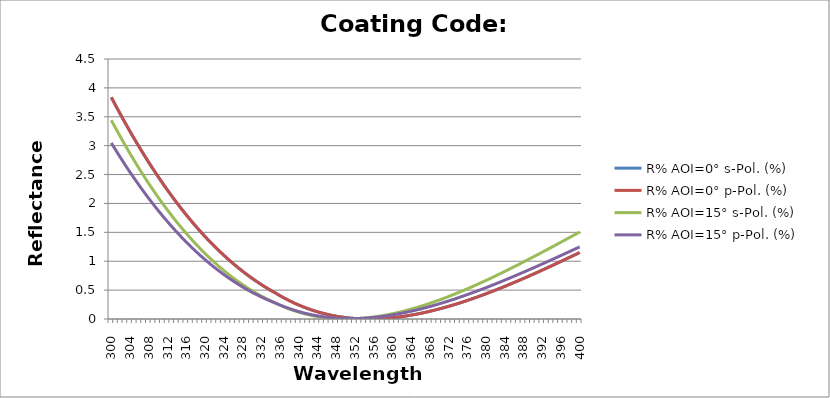
| Category | R% AOI=0° s-Pol. (%) | R% AOI=0° p-Pol. (%) | R% AOI=15° s-Pol. (%) | R% AOI=15° p-Pol. (%) |
|---|---|---|---|---|
| 300.0 | 3.836 | 3.836 | 3.44 | 3.047 |
| 301.0 | 3.683 | 3.683 | 3.29 | 2.915 |
| 302.0 | 3.534 | 3.534 | 3.143 | 2.786 |
| 303.0 | 3.387 | 3.387 | 3 | 2.661 |
| 304.0 | 3.245 | 3.245 | 2.861 | 2.54 |
| 305.0 | 3.106 | 3.106 | 2.726 | 2.421 |
| 306.0 | 2.97 | 2.97 | 2.595 | 2.306 |
| 307.0 | 2.838 | 2.838 | 2.467 | 2.194 |
| 308.0 | 2.709 | 2.709 | 2.343 | 2.086 |
| 309.0 | 2.584 | 2.584 | 2.223 | 1.98 |
| 310.0 | 2.462 | 2.462 | 2.106 | 1.878 |
| 311.0 | 2.344 | 2.344 | 1.993 | 1.78 |
| 312.0 | 2.229 | 2.229 | 1.884 | 1.684 |
| 313.0 | 2.117 | 2.117 | 1.778 | 1.591 |
| 314.0 | 2.009 | 2.009 | 1.675 | 1.502 |
| 315.0 | 1.904 | 1.904 | 1.576 | 1.415 |
| 316.0 | 1.802 | 1.802 | 1.481 | 1.332 |
| 317.0 | 1.704 | 1.704 | 1.389 | 1.252 |
| 318.0 | 1.608 | 1.608 | 1.301 | 1.174 |
| 319.0 | 1.516 | 1.516 | 1.216 | 1.1 |
| 320.0 | 1.428 | 1.428 | 1.134 | 1.028 |
| 321.0 | 1.342 | 1.342 | 1.056 | 0.959 |
| 322.0 | 1.26 | 1.26 | 0.981 | 0.894 |
| 323.0 | 1.18 | 1.18 | 0.909 | 0.831 |
| 324.0 | 1.104 | 1.104 | 0.84 | 0.77 |
| 325.0 | 1.03 | 1.03 | 0.774 | 0.713 |
| 326.0 | 0.96 | 0.96 | 0.712 | 0.658 |
| 327.0 | 0.893 | 0.893 | 0.652 | 0.606 |
| 328.0 | 0.828 | 0.828 | 0.596 | 0.556 |
| 329.0 | 0.766 | 0.766 | 0.542 | 0.509 |
| 330.0 | 0.707 | 0.707 | 0.491 | 0.464 |
| 331.0 | 0.651 | 0.651 | 0.443 | 0.422 |
| 332.0 | 0.597 | 0.597 | 0.398 | 0.382 |
| 333.0 | 0.546 | 0.546 | 0.356 | 0.345 |
| 334.0 | 0.498 | 0.498 | 0.316 | 0.309 |
| 335.0 | 0.452 | 0.452 | 0.279 | 0.276 |
| 336.0 | 0.404 | 0.404 | 0.241 | 0.242 |
| 337.0 | 0.359 | 0.359 | 0.206 | 0.21 |
| 338.0 | 0.317 | 0.317 | 0.174 | 0.18 |
| 339.0 | 0.278 | 0.278 | 0.145 | 0.153 |
| 340.0 | 0.242 | 0.242 | 0.119 | 0.129 |
| 341.0 | 0.209 | 0.209 | 0.096 | 0.107 |
| 342.0 | 0.178 | 0.178 | 0.075 | 0.087 |
| 343.0 | 0.15 | 0.15 | 0.057 | 0.07 |
| 344.0 | 0.125 | 0.125 | 0.042 | 0.055 |
| 345.0 | 0.102 | 0.102 | 0.029 | 0.042 |
| 346.0 | 0.082 | 0.082 | 0.019 | 0.031 |
| 347.0 | 0.064 | 0.064 | 0.011 | 0.023 |
| 348.0 | 0.048 | 0.048 | 0.005 | 0.016 |
| 349.0 | 0.035 | 0.035 | 0.002 | 0.011 |
| 350.0 | 0.024 | 0.024 | 0 | 0.008 |
| 351.0 | 0.015 | 0.015 | 0.001 | 0.007 |
| 352.0 | 0.008 | 0.008 | 0.004 | 0.008 |
| 353.0 | 0.004 | 0.004 | 0.009 | 0.01 |
| 354.0 | 0.001 | 0.001 | 0.015 | 0.014 |
| 355.0 | 0 | 0 | 0.024 | 0.02 |
| 356.0 | 0.001 | 0.001 | 0.034 | 0.028 |
| 357.0 | 0.004 | 0.004 | 0.046 | 0.036 |
| 358.0 | 0.008 | 0.008 | 0.059 | 0.046 |
| 359.0 | 0.014 | 0.014 | 0.074 | 0.058 |
| 360.0 | 0.021 | 0.021 | 0.091 | 0.071 |
| 361.0 | 0.03 | 0.03 | 0.109 | 0.085 |
| 362.0 | 0.041 | 0.041 | 0.128 | 0.1 |
| 363.0 | 0.053 | 0.053 | 0.149 | 0.117 |
| 364.0 | 0.066 | 0.066 | 0.171 | 0.134 |
| 365.0 | 0.081 | 0.081 | 0.194 | 0.153 |
| 366.0 | 0.097 | 0.097 | 0.219 | 0.173 |
| 367.0 | 0.115 | 0.115 | 0.244 | 0.194 |
| 368.0 | 0.133 | 0.133 | 0.271 | 0.216 |
| 369.0 | 0.153 | 0.153 | 0.299 | 0.238 |
| 370.0 | 0.174 | 0.174 | 0.328 | 0.262 |
| 371.0 | 0.196 | 0.196 | 0.358 | 0.287 |
| 372.0 | 0.219 | 0.219 | 0.389 | 0.312 |
| 373.0 | 0.243 | 0.243 | 0.421 | 0.338 |
| 374.0 | 0.268 | 0.268 | 0.454 | 0.366 |
| 375.0 | 0.294 | 0.294 | 0.487 | 0.393 |
| 376.0 | 0.321 | 0.321 | 0.522 | 0.422 |
| 377.0 | 0.348 | 0.348 | 0.557 | 0.451 |
| 378.0 | 0.377 | 0.377 | 0.593 | 0.481 |
| 379.0 | 0.406 | 0.406 | 0.63 | 0.511 |
| 380.0 | 0.436 | 0.436 | 0.667 | 0.542 |
| 381.0 | 0.467 | 0.467 | 0.705 | 0.574 |
| 382.0 | 0.499 | 0.499 | 0.744 | 0.606 |
| 383.0 | 0.531 | 0.531 | 0.783 | 0.639 |
| 384.0 | 0.564 | 0.564 | 0.823 | 0.672 |
| 385.0 | 0.598 | 0.598 | 0.863 | 0.706 |
| 386.0 | 0.632 | 0.632 | 0.904 | 0.74 |
| 387.0 | 0.666 | 0.666 | 0.945 | 0.775 |
| 388.0 | 0.701 | 0.701 | 0.986 | 0.81 |
| 389.0 | 0.737 | 0.737 | 1.028 | 0.845 |
| 390.0 | 0.773 | 0.773 | 1.07 | 0.88 |
| 391.0 | 0.809 | 0.809 | 1.113 | 0.916 |
| 392.0 | 0.846 | 0.846 | 1.156 | 0.952 |
| 393.0 | 0.883 | 0.883 | 1.199 | 0.989 |
| 394.0 | 0.92 | 0.92 | 1.242 | 1.025 |
| 395.0 | 0.958 | 0.958 | 1.286 | 1.062 |
| 396.0 | 0.996 | 0.996 | 1.33 | 1.099 |
| 397.0 | 1.035 | 1.035 | 1.374 | 1.136 |
| 398.0 | 1.073 | 1.073 | 1.418 | 1.173 |
| 399.0 | 1.112 | 1.112 | 1.461 | 1.21 |
| 400.0 | 1.15 | 1.15 | 1.505 | 1.248 |